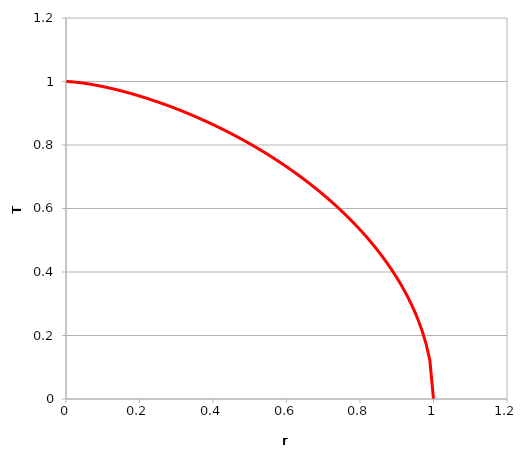
| Category | Series 0 |
|---|---|
| 0.0 | 1 |
| 0.01 | 0.999 |
| 0.02 | 0.999 |
| 0.03 | 0.997 |
| 0.04 | 0.996 |
| 0.05 | 0.994 |
| 0.06 | 0.993 |
| 0.07 | 0.991 |
| 0.08 | 0.989 |
| 0.09 | 0.986 |
| 0.1 | 0.984 |
| 0.11 | 0.982 |
| 0.12 | 0.979 |
| 0.13 | 0.976 |
| 0.14 | 0.973 |
| 0.15 | 0.971 |
| 0.16 | 0.967 |
| 0.17 | 0.964 |
| 0.18 | 0.961 |
| 0.19 | 0.958 |
| 0.2 | 0.954 |
| 0.21 | 0.951 |
| 0.22 | 0.947 |
| 0.23 | 0.943 |
| 0.24 | 0.939 |
| 0.25 | 0.935 |
| 0.26 | 0.931 |
| 0.27 | 0.927 |
| 0.28 | 0.923 |
| 0.29 | 0.919 |
| 0.3 | 0.914 |
| 0.31 | 0.91 |
| 0.32 | 0.905 |
| 0.33 | 0.9 |
| 0.34 | 0.895 |
| 0.35 | 0.89 |
| 0.36 | 0.885 |
| 0.37 | 0.88 |
| 0.38 | 0.875 |
| 0.39 | 0.87 |
| 0.4 | 0.864 |
| 0.41 | 0.859 |
| 0.42 | 0.853 |
| 0.43 | 0.847 |
| 0.44 | 0.842 |
| 0.45 | 0.836 |
| 0.46 | 0.829 |
| 0.47 | 0.823 |
| 0.48 | 0.817 |
| 0.49 | 0.811 |
| 0.5 | 0.804 |
| 0.51 | 0.797 |
| 0.52 | 0.791 |
| 0.53 | 0.784 |
| 0.54 | 0.777 |
| 0.55 | 0.769 |
| 0.56 | 0.762 |
| 0.57 | 0.755 |
| 0.58 | 0.747 |
| 0.59 | 0.739 |
| 0.6 | 0.732 |
| 0.61 | 0.724 |
| 0.62 | 0.715 |
| 0.63 | 0.707 |
| 0.64 | 0.699 |
| 0.65 | 0.69 |
| 0.66 | 0.681 |
| 0.67 | 0.672 |
| 0.68 | 0.663 |
| 0.69 | 0.653 |
| 0.7 | 0.644 |
| 0.71 | 0.634 |
| 0.72 | 0.624 |
| 0.73 | 0.613 |
| 0.74 | 0.603 |
| 0.75 | 0.592 |
| 0.76 | 0.581 |
| 0.77 | 0.57 |
| 0.78 | 0.558 |
| 0.79 | 0.546 |
| 0.8 | 0.533 |
| 0.81 | 0.521 |
| 0.82 | 0.507 |
| 0.83 | 0.494 |
| 0.84 | 0.48 |
| 0.85 | 0.465 |
| 0.86 | 0.45 |
| 0.87 | 0.434 |
| 0.88 | 0.418 |
| 0.89 | 0.4 |
| 0.9 | 0.382 |
| 0.91 | 0.363 |
| 0.92 | 0.343 |
| 0.93 | 0.321 |
| 0.94 | 0.298 |
| 0.95 | 0.272 |
| 0.96 | 0.244 |
| 0.97 | 0.211 |
| 0.98 | 0.173 |
| 0.99 | 0.122 |
| 1.0 | 0 |